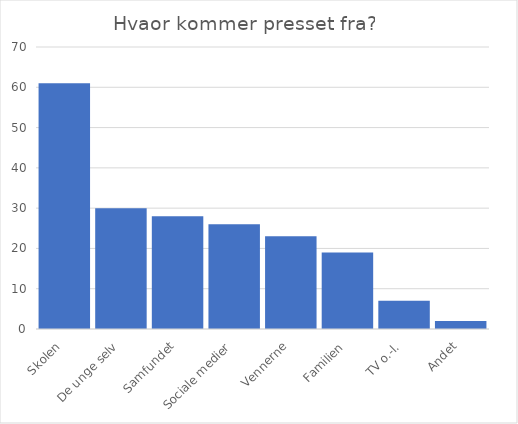
| Category | Series 0 |
|---|---|
| Skolen | 61 |
| De unge selv | 30 |
| Samfundet | 28 |
| Sociale medier | 26 |
| Vennerne | 23 |
| Familien | 19 |
| TV o.-l. | 7 |
| Andet | 2 |